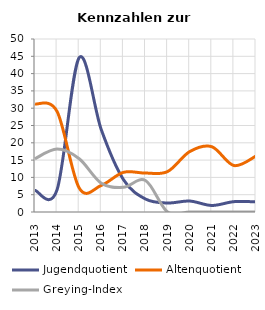
| Category | Jugendquotient | Altenquotient | Greying-Index |
|---|---|---|---|
| 2013.0 | 6.25 | 31.25 | 15.385 |
| 2014.0 | 6.452 | 29.032 | 18.182 |
| 2015.0 | 44.615 | 6.923 | 15.385 |
| 2016.0 | 23.776 | 7.692 | 8.333 |
| 2017.0 | 9.375 | 11.458 | 7.143 |
| 2018.0 | 3.75 | 11.25 | 9.091 |
| 2019.0 | 2.597 | 11.688 | 0 |
| 2020.0 | 3.17 | 17.46 | 0 |
| 2021.0 | 1.887 | 18.868 | 0 |
| 2022.0 | 2.99 | 13.43 | 0 |
| 2023.0 | 2.941 | 16.176 | 0 |